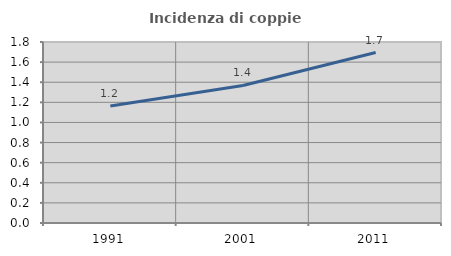
| Category | Incidenza di coppie miste |
|---|---|
| 1991.0 | 1.164 |
| 2001.0 | 1.368 |
| 2011.0 | 1.695 |